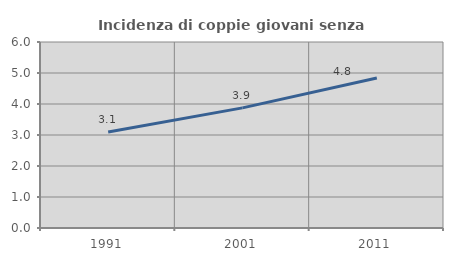
| Category | Incidenza di coppie giovani senza figli |
|---|---|
| 1991.0 | 3.097 |
| 2001.0 | 3.875 |
| 2011.0 | 4.836 |